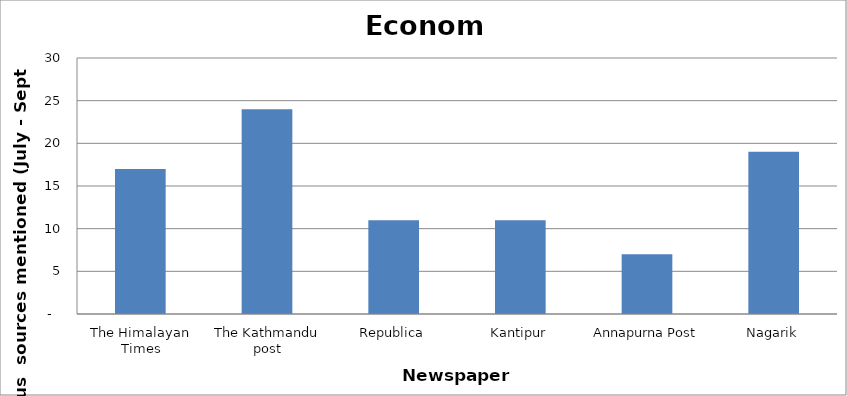
| Category | Economy |
|---|---|
| The Himalayan Times | 17 |
| The Kathmandu post | 24 |
| Republica | 11 |
| Kantipur | 11 |
| Annapurna Post | 7 |
| Nagarik | 19 |